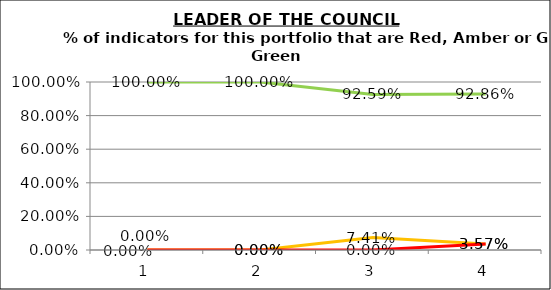
| Category | Green | Amber | Red |
|---|---|---|---|
| 0 | 1 | 0 | 0 |
| 1 | 1 | 0 | 0 |
| 2 | 0.926 | 0.074 | 0 |
| 3 | 0.929 | 0.036 | 0.036 |